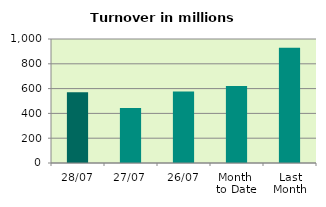
| Category | Series 0 |
|---|---|
| 28/07 | 571.48 |
| 27/07 | 442.83 |
| 26/07 | 576.389 |
| Month 
to Date | 621.063 |
| Last
Month | 929.439 |